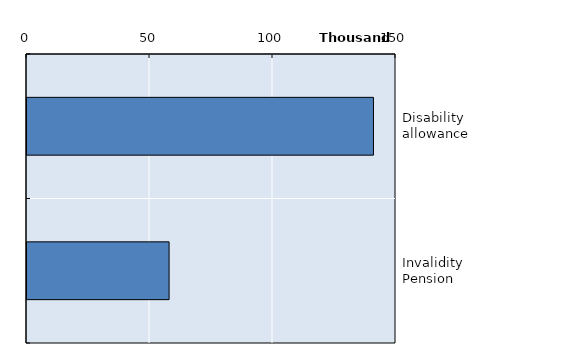
| Category | Series 0 |
|---|---|
| Disability allowance | 140835 |
| Invalidity Pension | 57768 |